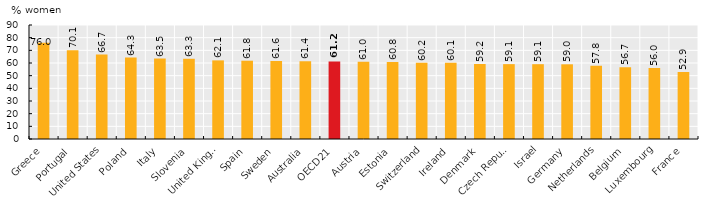
| Category | Series 0 |
|---|---|
| Greece | 75.992 |
| Portugal | 70.088 |
| United States | 66.71 |
| Poland | 64.328 |
| Italy | 63.542 |
| Slovenia | 63.34 |
| United Kingdom¹ | 62.06 |
| Spain | 61.8 |
| Sweden | 61.649 |
| Australia | 61.42 |
| OECD21 | 61.248 |
| Austria | 60.978 |
| Estonia | 60.824 |
| Switzerland | 60.195 |
| Ireland | 60.1 |
| Denmark | 59.219 |
| Czech Republic | 59.103 |
| Israel | 59.058 |
| Germany | 58.975 |
| Netherlands | 57.808 |
| Belgium | 56.663 |
| Luxembourg | 56.004 |
| France | 52.9 |